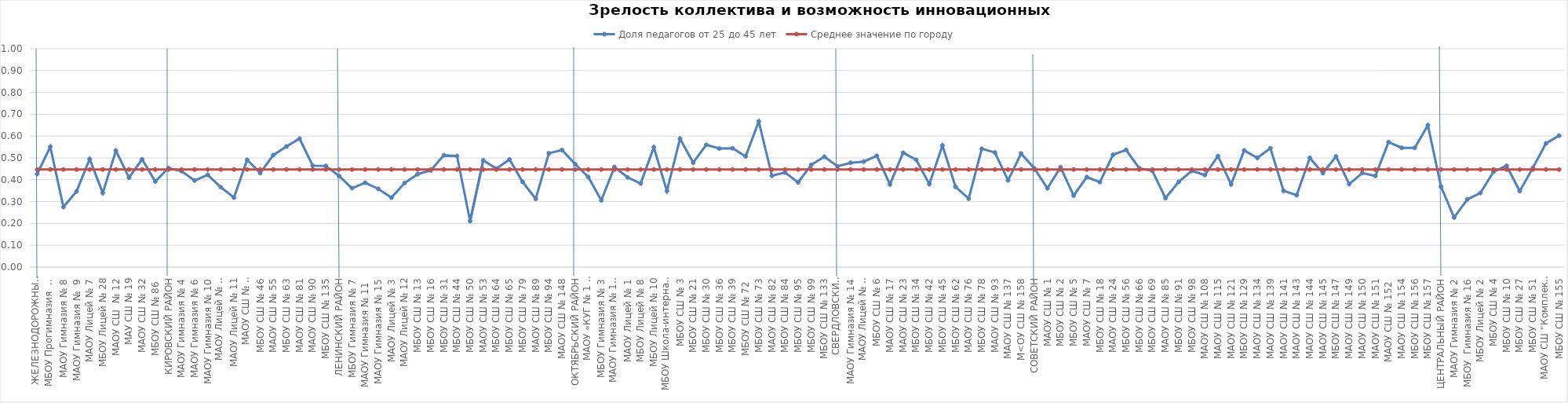
| Category | Доля педагогов от 25 до 45 лет | Среднее значение по городу |
|---|---|---|
| ЖЕЛЕЗНОДОРОЖНЫЙ РАЙОН | 0.426 | 0.447 |
| МБОУ Прогимназия  № 131 | 0.551 | 0.447 |
| МАОУ Гимназия № 8 | 0.275 | 0.447 |
| МАОУ Гимназия №  9 | 0.347 | 0.447 |
| МАОУ Лицей № 7 | 0.495 | 0.447 |
| МБОУ Лицей № 28 | 0.34 | 0.447 |
| МАОУ СШ  № 12 | 0.533 | 0.447 |
| МАУ СШ № 19 | 0.41 | 0.447 |
| МАОУ СШ № 32 | 0.494 | 0.447 |
| МБОУ СШ № 86  | 0.392 | 0.447 |
| КИРОВСКИЙ РАЙОН | 0.454 | 0.447 |
| МАОУ Гимназия № 4 | 0.439 | 0.447 |
| МАОУ Гимназия № 6 | 0.397 | 0.447 |
| МАОУ Гимназия № 10 | 0.423 | 0.447 |
| МАОУ Лицей № 6 "Перспектива" | 0.366 | 0.447 |
| МАОУ Лицей № 11 | 0.318 | 0.447 |
| МАОУ СШ № 8 "Созидание" | 0.491 | 0.447 |
| МБОУ СШ № 46 | 0.431 | 0.447 |
| МАОУ СШ № 55 | 0.513 | 0.447 |
| МБОУ СШ № 63 | 0.552 | 0.447 |
| МАОУ СШ № 81 | 0.588 | 0.447 |
| МАОУ СШ № 90 | 0.465 | 0.447 |
| МБОУ СШ № 135 | 0.463 | 0.447 |
| ЛЕНИНСКИЙ РАЙОН | 0.418 | 0.447 |
| МБОУ Гимназия № 7 | 0.361 | 0.447 |
| МАОУ Гимназия № 11  | 0.386 | 0.447 |
| МАОУ Гимназия № 15 | 0.358 | 0.447 |
| МАОУ Лицей № 3 | 0.318 | 0.447 |
| МАОУ Лицей № 12 | 0.385 | 0.447 |
| МБОУ СШ № 13 | 0.426 | 0.447 |
| МБОУ СШ № 16 | 0.443 | 0.447 |
| МБОУ СШ № 31 | 0.512 | 0.447 |
| МБОУ СШ № 44 | 0.509 | 0.447 |
| МБОУ СШ № 50 | 0.211 | 0.447 |
| МАОУ СШ № 53 | 0.489 | 0.447 |
| МБОУ СШ № 64 | 0.451 | 0.447 |
| МБОУ СШ № 65 | 0.493 | 0.447 |
| МБОУ СШ № 79 | 0.39 | 0.447 |
| МАОУ СШ № 89 | 0.312 | 0.447 |
| МБОУ СШ № 94 | 0.521 | 0.447 |
| МАОУ СШ № 148 | 0.536 | 0.447 |
| ОКТЯБРЬСКИЙ РАЙОН | 0.472 | 0.447 |
| МАОУ «КУГ № 1 – Универс» | 0.413 | 0.447 |
| МБОУ Гимназия № 3 | 0.306 | 0.447 |
| МАОУ Гимназия № 13 "Академ" | 0.458 | 0.447 |
| МАОУ Лицей № 1 | 0.411 | 0.447 |
| МБОУ Лицей № 8 | 0.383 | 0.447 |
| МБОУ Лицей № 10 | 0.548 | 0.447 |
| МБОУ Школа-интернат № 1 | 0.348 | 0.447 |
| МБОУ СШ № 3 | 0.588 | 0.447 |
| МБОУ СШ № 21 | 0.478 | 0.447 |
| МБОУ СШ № 30 | 0.56 | 0.447 |
| МБОУ СШ № 36 | 0.543 | 0.447 |
| МБОУ СШ № 39 | 0.544 | 0.447 |
| МБОУ СШ № 72  | 0.507 | 0.447 |
| МБОУ СШ № 73 | 0.667 | 0.447 |
| МАОУ СШ № 82 | 0.418 | 0.447 |
| МБОУ СШ № 84 | 0.433 | 0.447 |
| МБОУ СШ № 95 | 0.388 | 0.447 |
| МБОУ СШ № 99 | 0.468 | 0.447 |
| МБОУ СШ № 133 | 0.505 | 0.447 |
| СВЕРДЛОВСКИЙ РАЙОН | 0.462 | 0.447 |
| МАОУ Гимназия № 14 | 0.478 | 0.447 |
| МАОУ Лицей № 9 "Лидер" | 0.483 | 0.447 |
| МБОУ СШ № 6 | 0.51 | 0.447 |
| МАОУ СШ № 17 | 0.379 | 0.447 |
| МАОУ СШ № 23 | 0.524 | 0.447 |
| МБОУ СШ № 34 | 0.491 | 0.447 |
| МБОУ СШ № 42 | 0.38 | 0.447 |
| МБОУ СШ № 45 | 0.557 | 0.447 |
| МБОУ СШ № 62 | 0.367 | 0.447 |
| МАОУ СШ № 76 | 0.314 | 0.447 |
| МБОУ СШ № 78 | 0.542 | 0.447 |
| МАОУ СШ № 93 | 0.525 | 0.447 |
| МАОУ СШ № 137 | 0.397 | 0.447 |
| М<ОУ СШ № 158 | 0.52 | 0.447 |
| СОВЕТСКИЙ РАЙОН | 0.453 | 0.447 |
| МАОУ СШ № 1 | 0.361 | 0.447 |
| МБОУ СШ № 2 | 0.457 | 0.447 |
| МБОУ СШ № 5 | 0.328 | 0.447 |
| МАОУ СШ № 7 | 0.412 | 0.447 |
| МБОУ СШ № 18 | 0.389 | 0.447 |
| МАОУ СШ № 24 | 0.514 | 0.447 |
| МБОУ СШ № 56 | 0.537 | 0.447 |
| МБОУ СШ № 66 | 0.452 | 0.447 |
| МБОУ СШ № 69 | 0.441 | 0.447 |
| МАОУ СШ № 85 | 0.316 | 0.447 |
| МБОУ СШ № 91 | 0.39 | 0.447 |
| МБОУ СШ № 98 | 0.441 | 0.447 |
| МАОУ СШ № 108 | 0.422 | 0.447 |
| МАОУ СШ № 115 | 0.508 | 0.447 |
| МАОУ СШ № 121 | 0.379 | 0.447 |
| МБОУ СШ № 129 | 0.534 | 0.447 |
| МАОУ СШ № 134 | 0.5 | 0.447 |
| МАОУ СШ № 139 | 0.544 | 0.447 |
| МАОУ СШ № 141 | 0.349 | 0.447 |
| МАОУ СШ № 143 | 0.329 | 0.447 |
| МАОУ СШ № 144 | 0.5 | 0.447 |
| МАОУ СШ № 145 | 0.43 | 0.447 |
| МБОУ СШ № 147 | 0.506 | 0.447 |
| МАОУ СШ № 149 | 0.38 | 0.447 |
| МАОУ СШ № 150 | 0.431 | 0.447 |
| МАОУ СШ № 151 | 0.417 | 0.447 |
| МАОУ СШ № 152  | 0.572 | 0.447 |
| МАОУ СШ № 154 | 0.546 | 0.447 |
| МБОУ СШ № 156 | 0.546 | 0.447 |
| МБОУ СШ № 157 | 0.65 | 0.447 |
| ЦЕНТРАЛЬНЫЙ РАЙОН | 0.368 | 0.447 |
| МАОУ Гимназия № 2 | 0.227 | 0.447 |
| МБОУ  Гимназия № 16 | 0.31 | 0.447 |
| МБОУ Лицей № 2 | 0.339 | 0.447 |
| МБОУ СШ № 4 | 0.436 | 0.447 |
| МБОУ СШ № 10 | 0.464 | 0.447 |
| МБОУ СШ № 27 | 0.348 | 0.447 |
| МБОУ СШ № 51 | 0.455 | 0.447 |
| МАОУ СШ "Комплекс "Покровский" | 0.566 | 0.447 |
| МБОУ СШ № 155 | 0.602 | 0.447 |